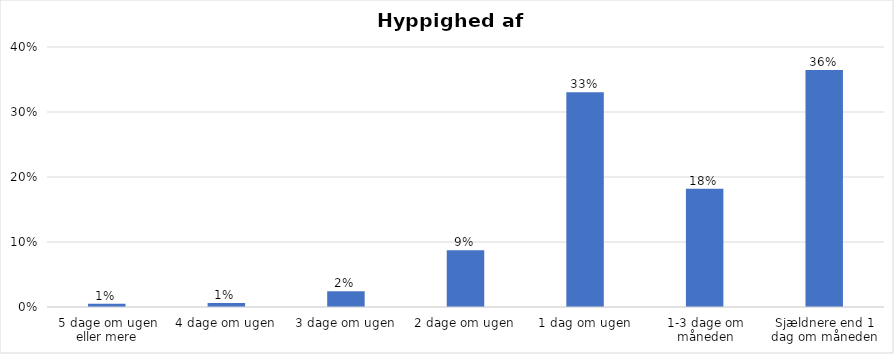
| Category | % |
|---|---|
| 5 dage om ugen eller mere | 0.005 |
| 4 dage om ugen | 0.006 |
| 3 dage om ugen | 0.024 |
| 2 dage om ugen | 0.087 |
| 1 dag om ugen | 0.33 |
| 1-3 dage om måneden | 0.182 |
| Sjældnere end 1 dag om måneden | 0.364 |